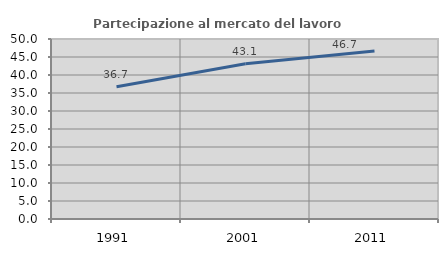
| Category | Partecipazione al mercato del lavoro  femminile |
|---|---|
| 1991.0 | 36.713 |
| 2001.0 | 43.122 |
| 2011.0 | 46.654 |